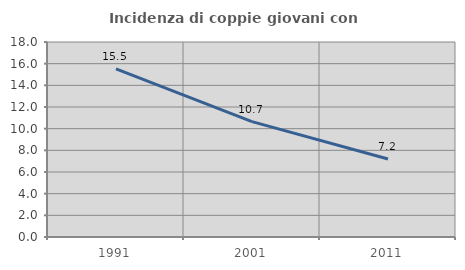
| Category | Incidenza di coppie giovani con figli |
|---|---|
| 1991.0 | 15.524 |
| 2001.0 | 10.652 |
| 2011.0 | 7.199 |